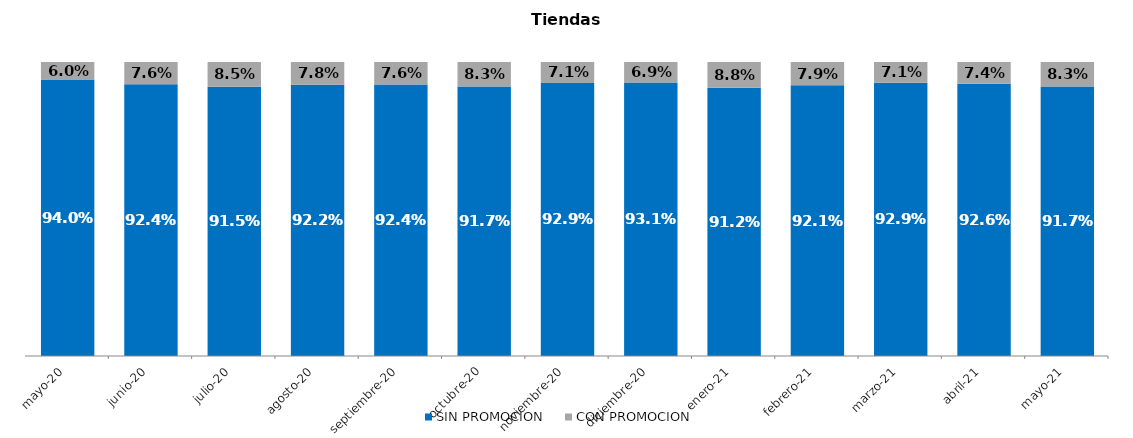
| Category | SIN PROMOCION   | CON PROMOCION   |
|---|---|---|
| 2020-05-01 | 0.94 | 0.06 |
| 2020-06-01 | 0.924 | 0.076 |
| 2020-07-01 | 0.915 | 0.085 |
| 2020-08-01 | 0.922 | 0.078 |
| 2020-09-01 | 0.924 | 0.076 |
| 2020-10-01 | 0.917 | 0.083 |
| 2020-11-01 | 0.929 | 0.071 |
| 2020-12-01 | 0.931 | 0.069 |
| 2021-01-01 | 0.912 | 0.088 |
| 2021-02-01 | 0.921 | 0.079 |
| 2021-03-01 | 0.929 | 0.071 |
| 2021-04-01 | 0.926 | 0.074 |
| 2021-05-01 | 0.917 | 0.083 |